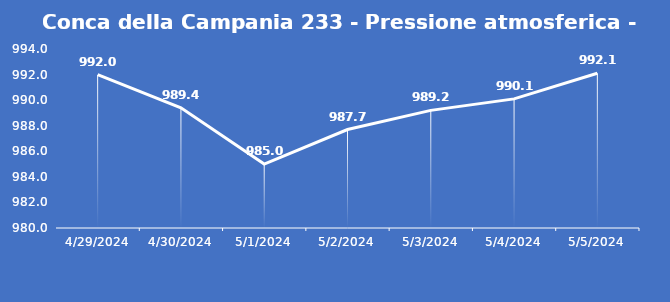
| Category | Conca della Campania 233 - Pressione atmosferica - Grezzo (hPa) |
|---|---|
| 4/29/24 | 992 |
| 4/30/24 | 989.4 |
| 5/1/24 | 985 |
| 5/2/24 | 987.7 |
| 5/3/24 | 989.2 |
| 5/4/24 | 990.1 |
| 5/5/24 | 992.1 |